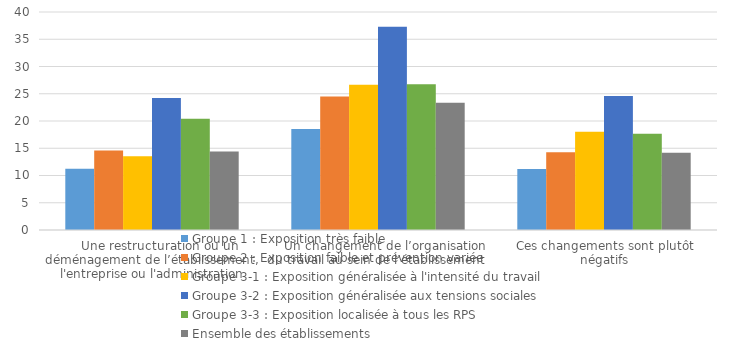
| Category | Groupe 1 : Exposition très faible | Groupe 2 : Exposition faible et prévention variée | Groupe 3-1 : Exposition généralisée à l'intensité du travail | Groupe 3-2 : Exposition généralisée aux tensions sociales | Groupe 3-3 : Exposition localisée à tous les RPS | Ensemble des établissements |
|---|---|---|---|---|---|---|
|    Une restructuration ou un déménagement de l’établissement, l'entreprise ou l'administration | 11.24 | 14.58 | 13.51 | 24.24 | 20.42 | 14.4 |
|    Un changement de l’organisation du travail au sein de l’établissement  | 18.54 | 24.51 | 26.65 | 37.29 | 26.76 | 23.36 |
| Ces changements sont plutôt négatifs | 11.2 | 14.27 | 18.03 | 24.59 | 17.65 | 14.16 |